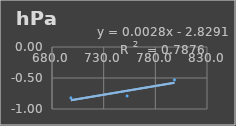
| Category | Presión Atmosférica |
|---|---|
| 698.3 | -0.82 |
| 752.7 | -0.79 |
| 798.5 | -0.53 |